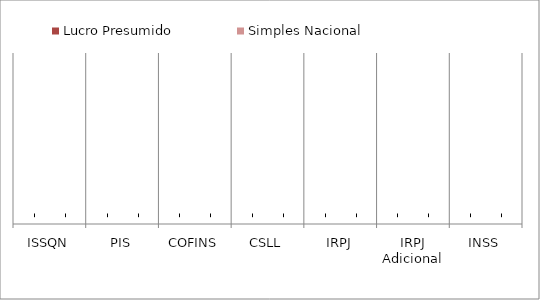
| Category | Lucro Presumido | Simples Nacional |
|---|---|---|
| ISSQN | 0 | 0 |
| PIS | 0 | 0 |
| COFINS | 0 | 0 |
| CSLL | 0 | 0 |
| IRPJ | 0 | 0 |
| IRPJ Adicional | 0 | 0 |
| INSS | 0 | 0 |